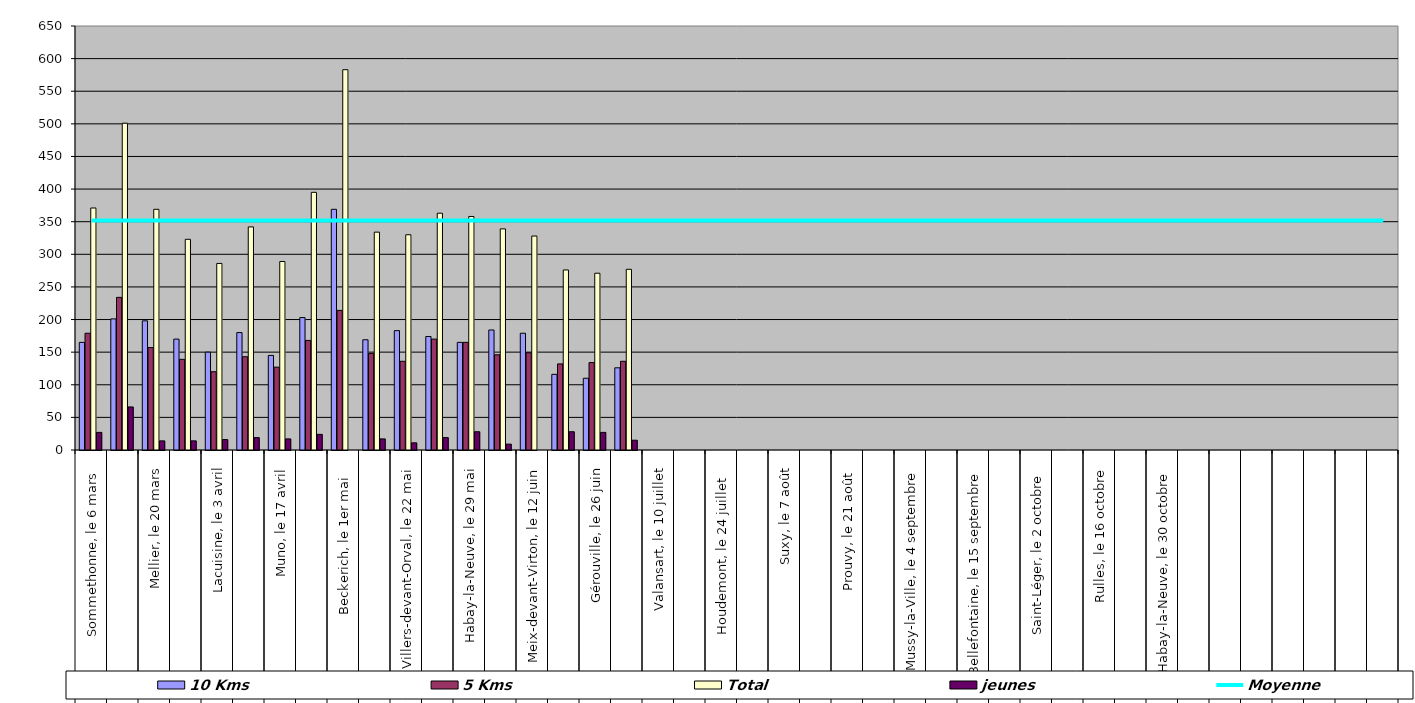
| Category | 10 Kms | 5 Kms | Total | jeunes |
|---|---|---|---|---|
| 0 | 165 | 179 | 371 | 27 |
| 1 | 201 | 234 | 501 | 66 |
| 2 | 198 | 157 | 369 | 14 |
| 3 | 170 | 139 | 323 | 14 |
| 4 | 150 | 120 | 286 | 16 |
| 5 | 180 | 143 | 342 | 19 |
| 6 | 145 | 127 | 289 | 17 |
| 7 | 203 | 168 | 395 | 24 |
| 8 | 369 | 214 | 583 | 0 |
| 9 | 169 | 148 | 334 | 17 |
| 10 | 183 | 136 | 330 | 11 |
| 11 | 174 | 170 | 363 | 19 |
| 12 | 165 | 165 | 358 | 28 |
| 13 | 184 | 146 | 339 | 9 |
| 14 | 179 | 149 | 328 | 0 |
| 15 | 116 | 132 | 276 | 28 |
| 16 | 110 | 134 | 271 | 27 |
| 17 | 126 | 136 | 277 | 15 |
| 18 | 0 | 0 | 0 | 0 |
| 19 | 0 | 0 | 0 | 0 |
| 20 | 0 | 0 | 0 | 0 |
| 21 | 0 | 0 | 0 | 0 |
| 22 | 0 | 0 | 0 | 0 |
| 23 | 0 | 0 | 0 | 0 |
| 24 | 0 | 0 | 0 | 0 |
| 25 | 0 | 0 | 0 | 0 |
| 26 | 0 | 0 | 0 | 0 |
| 27 | 0 | 0 | 0 | 0 |
| 28 | 0 | 0 | 0 | 0 |
| 29 | 0 | 0 | 0 | 0 |
| 30 | 0 | 0 | 0 | 0 |
| 31 | 0 | 0 | 0 | 0 |
| 32 | 0 | 0 | 0 | 0 |
| 33 | 0 | 0 | 0 | 0 |
| 34 | 0 | 0 | 0 | 0 |
| 35 | 0 | 0 | 0 | 0 |
| 36 | 0 | 0 | 0 | 0 |
| 37 | 0 | 0 | 0 | 0 |
| 38 | 0 | 0 | 0 | 0 |
| 39 | 0 | 0 | 0 | 0 |
| 40 | 0 | 0 | 0 | 0 |
| 41 | 0 | 0 | 0 | 0 |